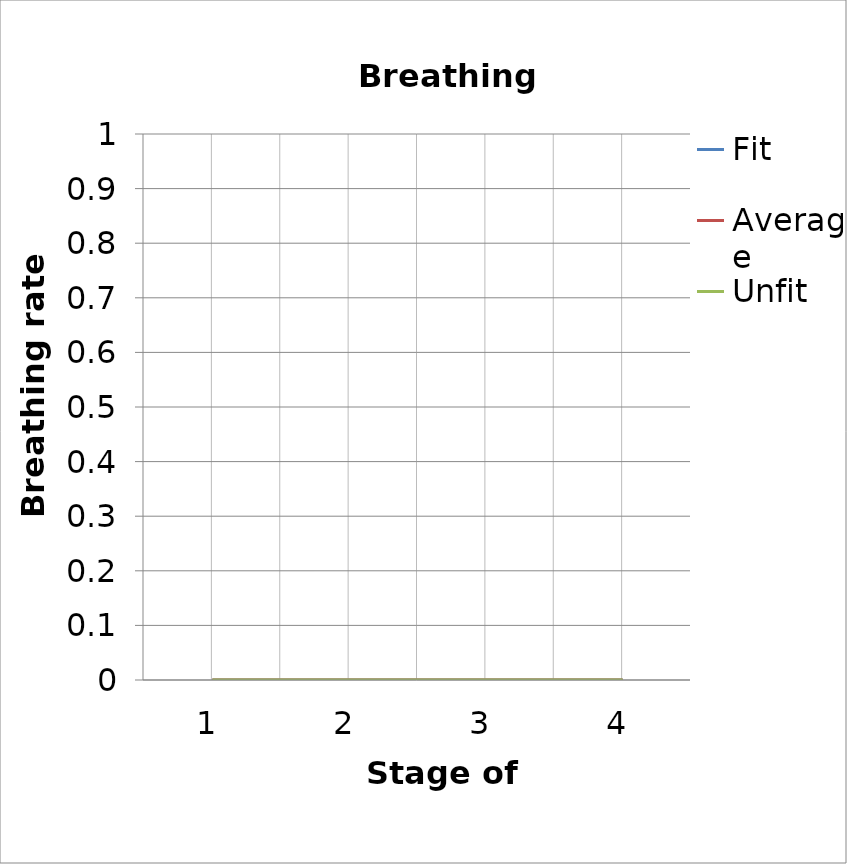
| Category | Fit | Average | Unfit |
|---|---|---|---|
| 0 | 0 | 0 | 0 |
| 1 | 0 | 0 | 0 |
| 2 | 0 | 0 | 0 |
| 3 | 0 | 0 | 0 |